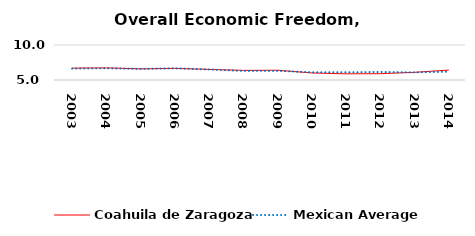
| Category | Coahuila de Zaragoza | Mexican Average  |
|---|---|---|
| 2003.0 | 6.696 | 6.632 |
| 2004.0 | 6.737 | 6.678 |
| 2005.0 | 6.591 | 6.582 |
| 2006.0 | 6.664 | 6.668 |
| 2007.0 | 6.512 | 6.508 |
| 2008.0 | 6.372 | 6.3 |
| 2009.0 | 6.395 | 6.3 |
| 2010.0 | 6.005 | 6.105 |
| 2011.0 | 5.883 | 6.103 |
| 2012.0 | 5.9 | 6.144 |
| 2013.0 | 6.096 | 6.087 |
| 2014.0 | 6.416 | 6.195 |